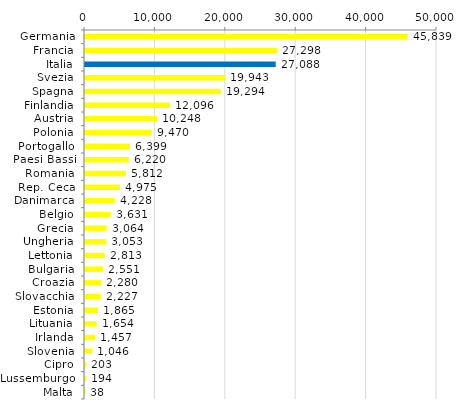
| Category | Series 0 |
|---|---|
| Germania | 45839.004 |
| Francia | 27297.574 |
| Italia | 27088.258 |
| Svezia | 19943.121 |
| Spagna | 19293.745 |
| Finlandia | 12095.541 |
| Austria | 10247.581 |
| Polonia | 9470.19 |
| Portogallo | 6399.018 |
| Paesi Bassi | 6219.708 |
| Romania | 5811.518 |
| Rep. Ceca | 4974.697 |
| Danimarca | 4228.122 |
| Belgio | 3630.546 |
| Grecia | 3063.748 |
| Ungheria | 3052.766 |
| Lettonia | 2813.059 |
| Bulgaria | 2551.226 |
| Croazia | 2280.028 |
| Slovacchia | 2227.223 |
| Estonia | 1865.388 |
| Lituania | 1654.372 |
| Irlanda | 1456.762 |
| Slovenia | 1045.539 |
| Cipro | 203.189 |
| Lussemburgo | 194.271 |
| Malta | 38.044 |